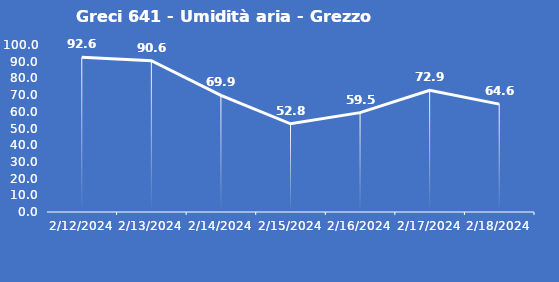
| Category | Greci 641 - Umidità aria - Grezzo (%) |
|---|---|
| 2/12/24 | 92.6 |
| 2/13/24 | 90.6 |
| 2/14/24 | 69.9 |
| 2/15/24 | 52.8 |
| 2/16/24 | 59.5 |
| 2/17/24 | 72.9 |
| 2/18/24 | 64.6 |